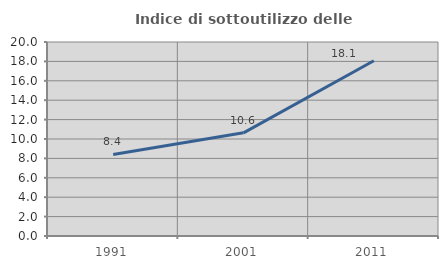
| Category | Indice di sottoutilizzo delle abitazioni  |
|---|---|
| 1991.0 | 8.404 |
| 2001.0 | 10.635 |
| 2011.0 | 18.07 |